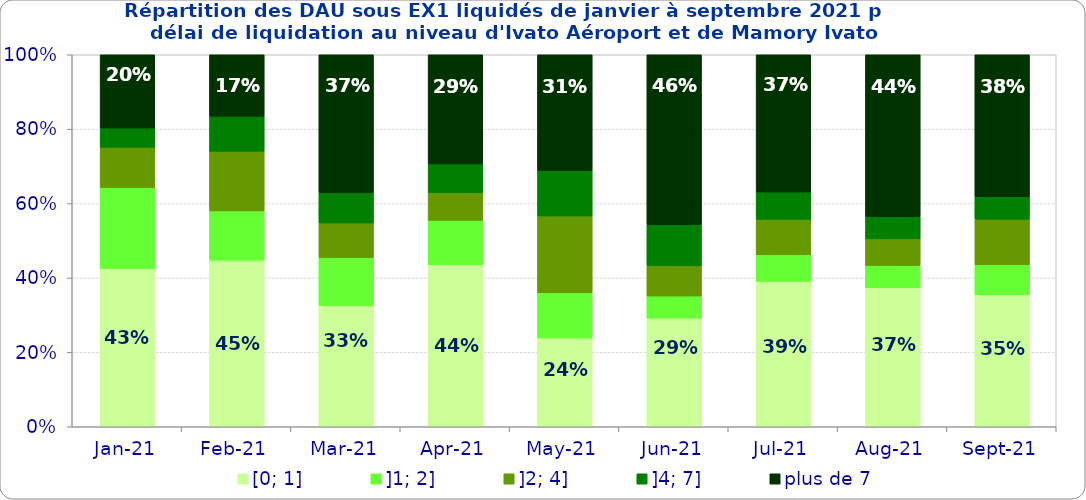
| Category | [0; 1] | ]1; 2] | ]2; 4] | ]4; 7] | plus de 7 |
|---|---|---|---|---|---|
| 2021-01-01 | 0.426 | 0.217 | 0.109 | 0.051 | 0.197 |
| 2021-02-01 | 0.448 | 0.132 | 0.16 | 0.094 | 0.165 |
| 2021-03-01 | 0.326 | 0.129 | 0.093 | 0.081 | 0.371 |
| 2021-04-01 | 0.436 | 0.119 | 0.075 | 0.077 | 0.294 |
| 2021-05-01 | 0.239 | 0.122 | 0.206 | 0.122 | 0.312 |
| 2021-06-01 | 0.292 | 0.059 | 0.081 | 0.11 | 0.457 |
| 2021-07-01 | 0.391 | 0.071 | 0.095 | 0.073 | 0.369 |
| 2021-08-01 | 0.374 | 0.06 | 0.072 | 0.06 | 0.435 |
| 2021-09-01 | 0.355 | 0.081 | 0.122 | 0.06 | 0.382 |